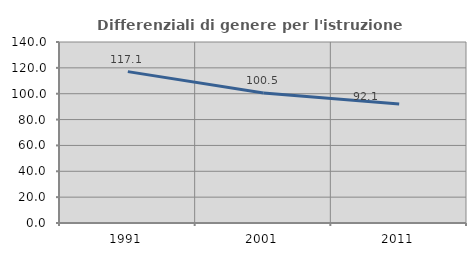
| Category | Differenziali di genere per l'istruzione superiore |
|---|---|
| 1991.0 | 117.09 |
| 2001.0 | 100.523 |
| 2011.0 | 92.105 |